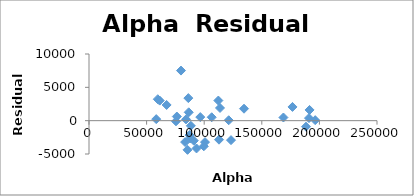
| Category | Series 0 |
|---|---|
| 93335.5 | -4167.048 |
| 85534.7 | -4374.234 |
| 87948.7 | -2679.175 |
| 90970.7 | -3003.884 |
| 88400.3 | -771.306 |
| 86242.2 | 3384.062 |
| 79857.5 | 7514.465 |
| 61388.6 | 3009.569 |
| 59704.0 | 3216.001 |
| 58356.1 | 229.225 |
| 67380.9 | 2354.949 |
| 76250.0 | 619.072 |
| 75493.9 | -95.047 |
| 86570.0 | 1254.936 |
| 84231.8 | 194.974 |
| 96598.9 | 537.352 |
| 121289.1 | 63.12 |
| 112854.8 | -2851.778 |
| 123265.0 | -2918.85 |
| 99658.21 | -3842.813 |
| 100713.6 | -3220.046 |
| 83452.9 | -3213.289 |
| 87284.2 | -2161.585 |
| 106531.1 | 511.381 |
| 112286.4 | 3016.719 |
| 113725.3 | 1902.559 |
| 134572.5 | 1794.254 |
| 168771.6 | 473.343 |
| 176649.1 | 2058.031 |
| 196354.6 | 75.332 |
| 188372.3 | -902.205 |
| 191449.8 | 1608.399 |
| 190964.4 | 383.516 |